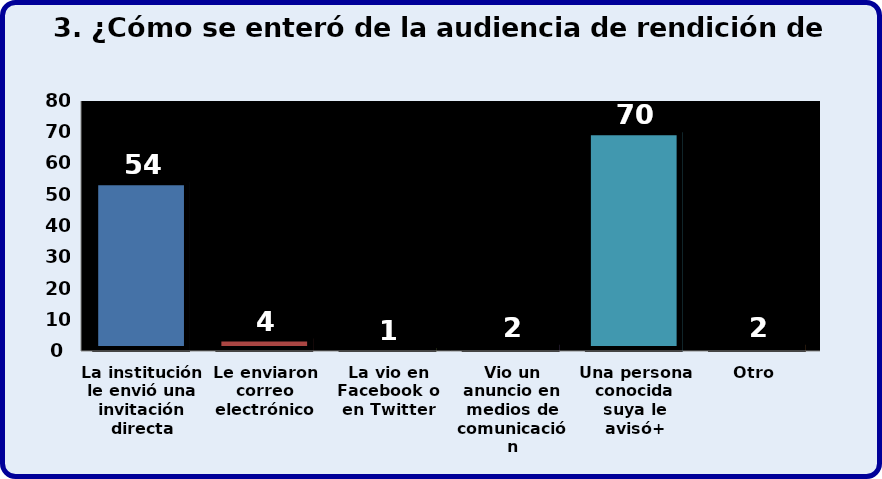
| Category | Series 0 |
|---|---|
| La institución le envió una invitación directa | 54 |
| Le enviaron correo electrónico | 4 |
| La vio en Facebook o en Twitter | 1 |
| Vio un anuncio en medios de comunicación | 2 |
| Una persona conocida suya le avisó+ | 70 |
| Otro  | 2 |